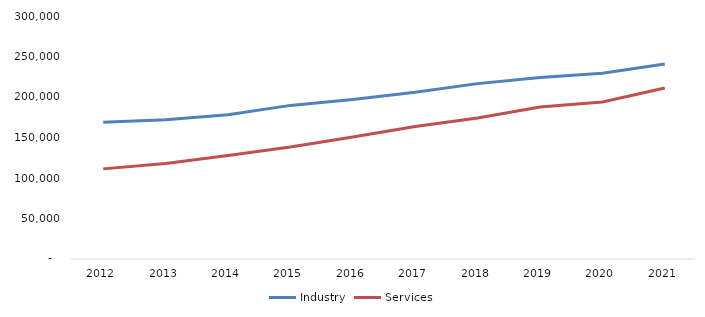
| Category | Industry | Services |
|---|---|---|
| 2012.0 | 168729 | 111269 |
| 2013.0 | 171797 | 117788 |
| 2014.0 | 178151 | 127806 |
| 2015.0 | 189649 | 138289 |
| 2016.0 | 196860 | 150540 |
| 2017.0 | 205813 | 163654 |
| 2018.0 | 216523 | 174166 |
| 2019.0 | 224012 | 187521 |
| 2020.0 | 229303 | 193733 |
| 2021.0 | 240737 | 211208 |